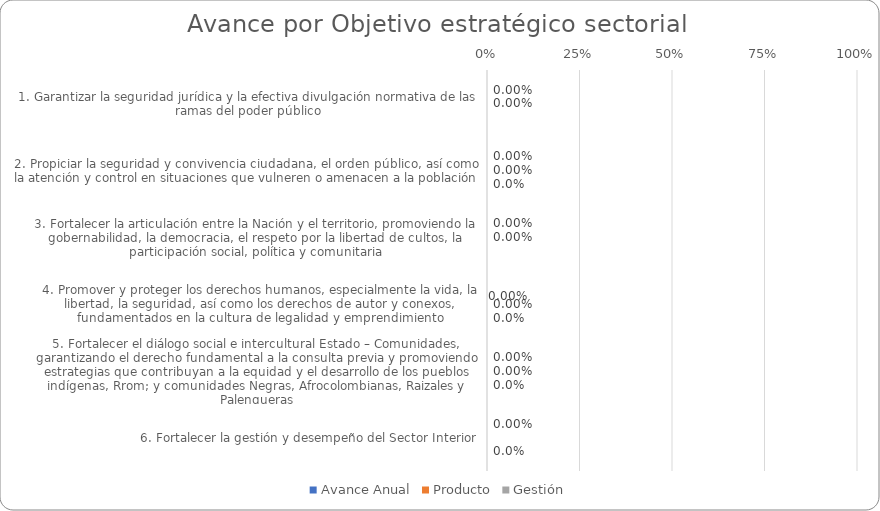
| Category | Avance Anual | Producto | Gestión |
|---|---|---|---|
| 1. Garantizar la seguridad jurídica y la efectiva divulgación normativa de las ramas del poder público | 0 | 0 | 0 |
| 2. Propiciar la seguridad y convivencia ciudadana, el orden público, así como la atención y control en situaciones que vulneren o amenacen a la población | 0 | 0 | 0 |
| 3. Fortalecer la articulación entre la Nación y el territorio, promoviendo la gobernabilidad, la democracia, el respeto por la libertad de cultos, la participación social, política y comunitaria | 0 | 0 | 0 |
| 4. Promover y proteger los derechos humanos, especialmente la vida, la libertad, la seguridad, así como los derechos de autor y conexos, fundamentados en la cultura de legalidad y emprendimiento | 0 | 0 | 0 |
| 5. Fortalecer el diálogo social e intercultural Estado – Comunidades, garantizando el derecho fundamental a la consulta previa y promoviendo estrategias que contribuyan a la equidad y el desarrollo de los pueblos indígenas, Rrom; y comunidades Negras, Afr | 0 | 0 | 0 |
| 6. Fortalecer la gestión y desempeño del Sector Interior | 0 | 0 | 0 |